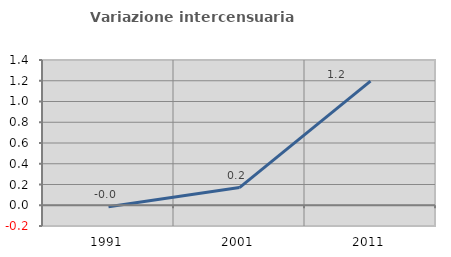
| Category | Variazione intercensuaria annua |
|---|---|
| 1991.0 | -0.013 |
| 2001.0 | 0.171 |
| 2011.0 | 1.196 |